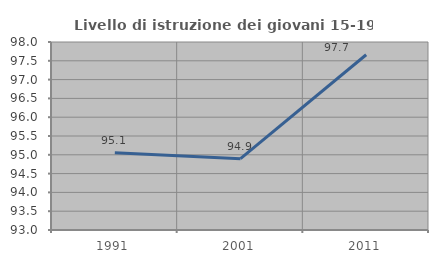
| Category | Livello di istruzione dei giovani 15-19 anni |
|---|---|
| 1991.0 | 95.052 |
| 2001.0 | 94.898 |
| 2011.0 | 97.661 |